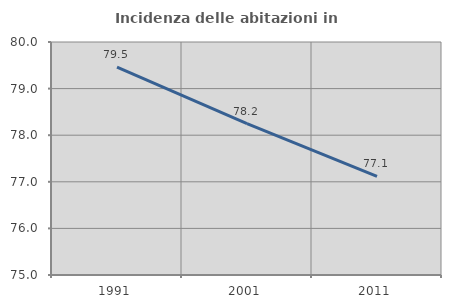
| Category | Incidenza delle abitazioni in proprietà  |
|---|---|
| 1991.0 | 79.463 |
| 2001.0 | 78.247 |
| 2011.0 | 77.118 |